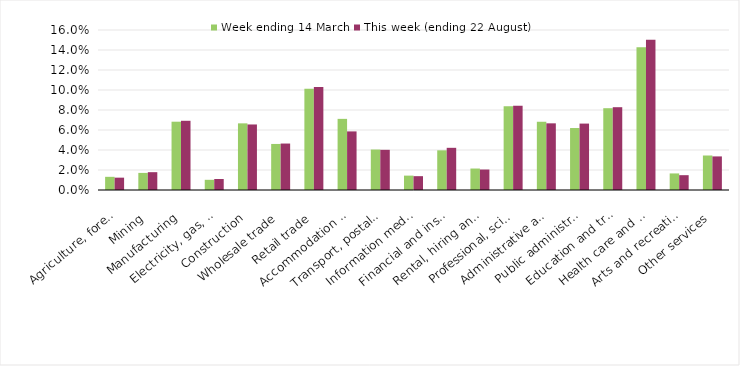
| Category | Week ending 14 March | This week (ending 22 August) |
|---|---|---|
| Agriculture, forestry and fishing | 0.013 | 0.012 |
| Mining | 0.017 | 0.018 |
| Manufacturing | 0.068 | 0.069 |
| Electricity, gas, water and waste services | 0.01 | 0.011 |
| Construction | 0.067 | 0.066 |
| Wholesale trade | 0.046 | 0.046 |
| Retail trade | 0.101 | 0.103 |
| Accommodation and food services | 0.071 | 0.059 |
| Transport, postal and warehousing | 0.04 | 0.04 |
| Information media and telecommunications | 0.014 | 0.014 |
| Financial and insurance services | 0.04 | 0.042 |
| Rental, hiring and real estate services | 0.021 | 0.02 |
| Professional, scientific and technical services | 0.084 | 0.084 |
| Administrative and support services | 0.068 | 0.067 |
| Public administration and safety | 0.062 | 0.066 |
| Education and training | 0.082 | 0.083 |
| Health care and social assistance | 0.143 | 0.15 |
| Arts and recreation services | 0.017 | 0.015 |
| Other services | 0.034 | 0.034 |